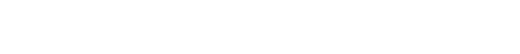
| Category | oui | non | NA |
|---|---|---|---|
| 0 | 0 | 0 | 0 |